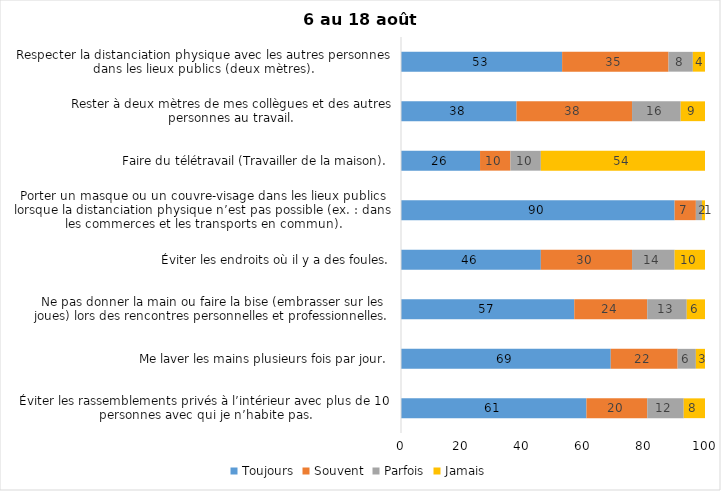
| Category | Toujours | Souvent | Parfois | Jamais |
|---|---|---|---|---|
| Éviter les rassemblements privés à l’intérieur avec plus de 10 personnes avec qui je n’habite pas. | 61 | 20 | 12 | 8 |
| Me laver les mains plusieurs fois par jour. | 69 | 22 | 6 | 3 |
| Ne pas donner la main ou faire la bise (embrasser sur les joues) lors des rencontres personnelles et professionnelles. | 57 | 24 | 13 | 6 |
| Éviter les endroits où il y a des foules. | 46 | 30 | 14 | 10 |
| Porter un masque ou un couvre-visage dans les lieux publics lorsque la distanciation physique n’est pas possible (ex. : dans les commerces et les transports en commun). | 90 | 7 | 2 | 1 |
| Faire du télétravail (Travailler de la maison). | 26 | 10 | 10 | 54 |
| Rester à deux mètres de mes collègues et des autres personnes au travail. | 38 | 38 | 16 | 9 |
| Respecter la distanciation physique avec les autres personnes dans les lieux publics (deux mètres). | 53 | 35 | 8 | 4 |